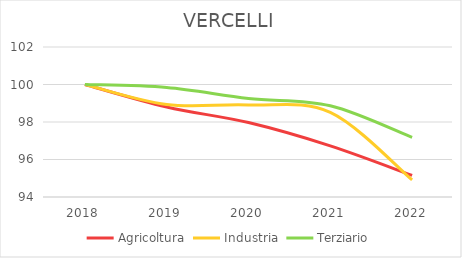
| Category | Agricoltura | Industria | Terziario |
|---|---|---|---|
| 2018.0 | 100 | 100 | 100 |
| 2019.0 | 98.798 | 98.931 | 99.839 |
| 2020.0 | 97.969 | 98.911 | 99.254 |
| 2021.0 | 96.726 | 98.512 | 98.867 |
| 2022.0 | 95.151 | 94.909 | 97.177 |